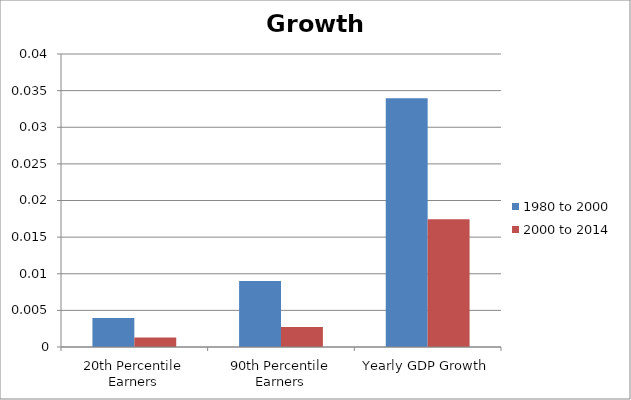
| Category | 1980 to 2000 | 2000 to 2014 |
|---|---|---|
| 20th Percentile Earners | 0.004 | 0.001 |
| 90th Percentile Earners | 0.009 | 0.003 |
| Yearly GDP Growth | 0.034 | 0.017 |